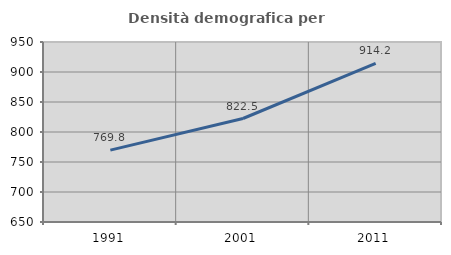
| Category | Densità demografica |
|---|---|
| 1991.0 | 769.835 |
| 2001.0 | 822.484 |
| 2011.0 | 914.191 |